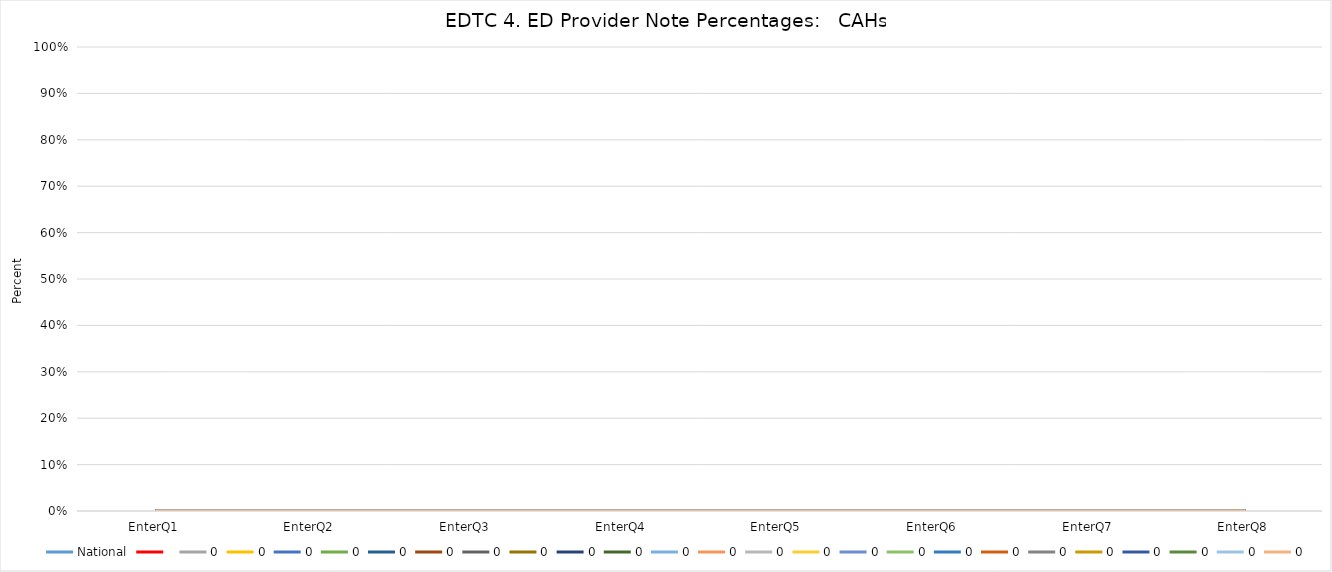
| Category | National |   | 0 |
|---|---|---|---|
| EnterQ1 |  |  | 0 |
| EnterQ2 |  |  | 0 |
| EnterQ3 |  |  | 0 |
| EnterQ4 |  |  | 0 |
| EnterQ5 |  |  | 0 |
| EnterQ6 |  |  | 0 |
| EnterQ7 |  |  | 0 |
| EnterQ8 |  |  | 0 |